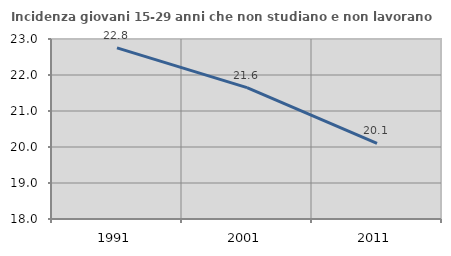
| Category | Incidenza giovani 15-29 anni che non studiano e non lavorano  |
|---|---|
| 1991.0 | 22.754 |
| 2001.0 | 21.649 |
| 2011.0 | 20.101 |